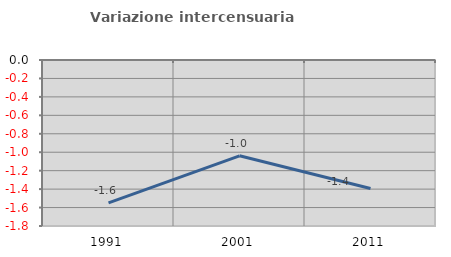
| Category | Variazione intercensuaria annua |
|---|---|
| 1991.0 | -1.55 |
| 2001.0 | -1.039 |
| 2011.0 | -1.394 |